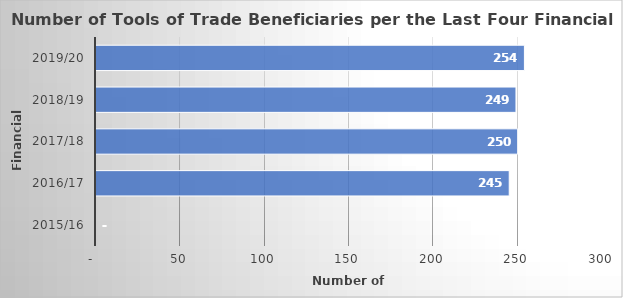
| Category | GRAND TOTAL |
|---|---|
| 2015/16 | 0 |
| 2016/17 | 245 |
| 2017/18 | 250 |
| 2018/19 | 249 |
| 2019/20 | 254 |